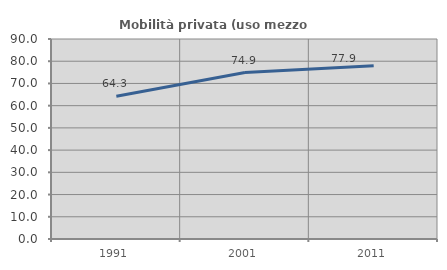
| Category | Mobilità privata (uso mezzo privato) |
|---|---|
| 1991.0 | 64.277 |
| 2001.0 | 74.905 |
| 2011.0 | 77.919 |